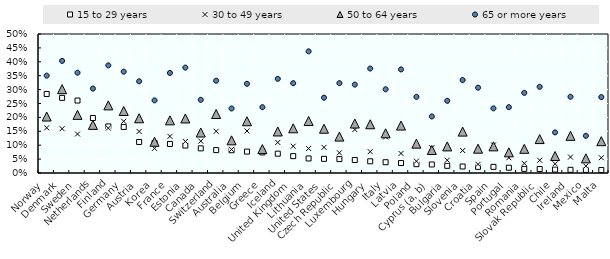
| Category | 15 to 29 years | 30 to 49 years | 50 to 64 years | 65 or more years |
|---|---|---|---|---|
| Norway | 0.284 | 0.163 | 0.203 | 0.35 |
| Denmark | 0.27 | 0.159 | 0.302 | 0.403 |
| Sweden | 0.261 | 0.14 | 0.209 | 0.361 |
| Netherlands | 0.198 | 0.165 | 0.173 | 0.304 |
| Finland | 0.168 | 0.161 | 0.243 | 0.387 |
| Germany | 0.166 | 0.186 | 0.223 | 0.364 |
| Austria | 0.112 | 0.149 | 0.197 | 0.33 |
| Korea | 0.108 | 0.089 | 0.112 | 0.261 |
| France | 0.104 | 0.132 | 0.189 | 0.36 |
| Estonia | 0.099 | 0.113 | 0.196 | 0.379 |
| Canada | 0.089 | 0.115 | 0.146 | 0.263 |
| Switzerland | 0.082 | 0.15 | 0.212 | 0.332 |
| Australia | 0.082 | 0.085 | 0.118 | 0.232 |
| Belgium | 0.077 | 0.151 | 0.186 | 0.321 |
| Greece | 0.074 | 0.078 | 0.086 | 0.237 |
| Iceland | 0.07 | 0.11 | 0.149 | 0.339 |
| United Kingdom | 0.061 | 0.096 | 0.161 | 0.323 |
| Lithuania | 0.052 | 0.088 | 0.187 | 0.438 |
| United States | 0.051 | 0.092 | 0.159 | 0.271 |
| Czech Republic | 0.05 | 0.073 | 0.131 | 0.323 |
| Luxembourg | 0.047 | 0.156 | 0.178 | 0.318 |
| Hungary | 0.042 | 0.077 | 0.175 | 0.376 |
| Italy | 0.039 | 0.13 | 0.143 | 0.301 |
| Latvia | 0.036 | 0.07 | 0.171 | 0.373 |
| Poland | 0.032 | 0.042 | 0.106 | 0.274 |
| Cyprus (a, b) | 0.031 | 0.091 | 0.083 | 0.204 |
| Bulgaria | 0.026 | 0.046 | 0.096 | 0.26 |
| Slovenia | 0.023 | 0.081 | 0.149 | 0.334 |
| Croatia | 0.022 | 0.031 | 0.087 | 0.307 |
| Spain | 0.022 | 0.101 | 0.096 | 0.233 |
| Portugal | 0.019 | 0.055 | 0.074 | 0.237 |
| Romania | 0.015 | 0.035 | 0.087 | 0.288 |
| Slovak Republic | 0.014 | 0.046 | 0.122 | 0.31 |
| Chile | 0.012 | 0.033 | 0.061 | 0.146 |
| Ireland | 0.011 | 0.057 | 0.134 | 0.274 |
| Mexico | 0.011 | 0.025 | 0.053 | 0.134 |
| Malta | 0.011 | 0.055 | 0.114 | 0.273 |